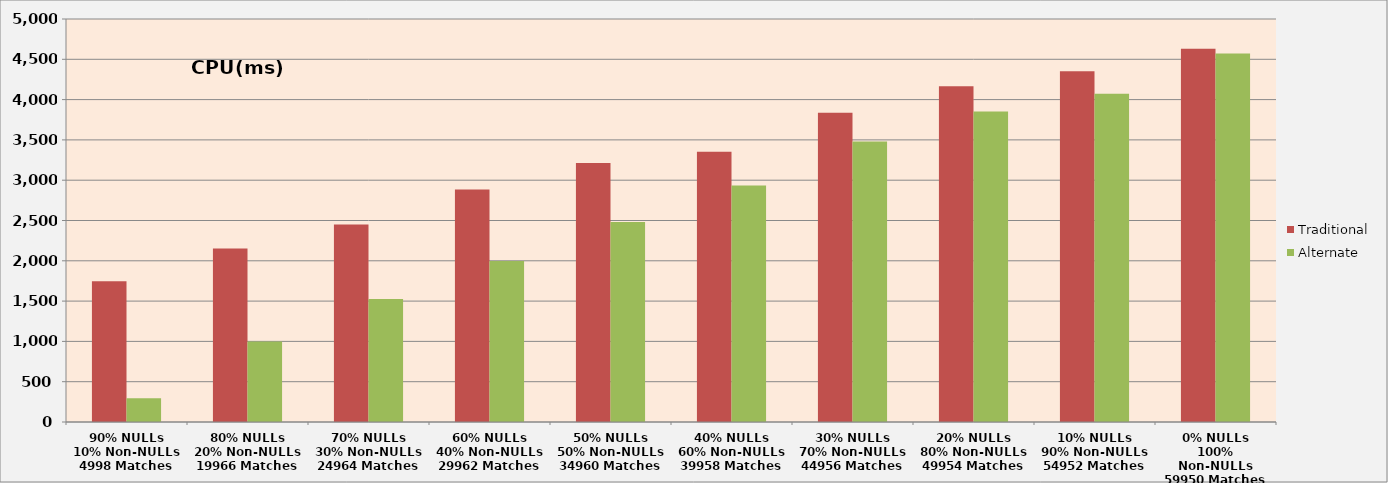
| Category | Traditional | Alternate |
|---|---|---|
| 90% NULLs
10% Non-NULLs
4998 Matches | 1747 | 296 |
| 80% NULLs
20% Non-NULLs
19966 Matches | 2154 | 999 |
| 70% NULLs
30% Non-NULLs
24964 Matches | 2450 | 1527 |
| 60% NULLs
40% Non-NULLs
29962 Matches | 2886 | 1998 |
| 50% NULLs
50% Non-NULLs
34960 Matches | 3214 | 2480 |
| 40% NULLs
60% Non-NULLs
39958 Matches | 3354 | 2933 |
| 30% NULLs
70% Non-NULLs
44956 Matches | 3837 | 3479 |
| 20% NULLs
80% Non-NULLs
49954 Matches | 4166 | 3853 |
| 10% NULLs
90% Non-NULLs
54952 Matches | 4353 | 4072 |
| 0% NULLs
100% Non-NULLs
59950 Matches | 4632 | 4571 |